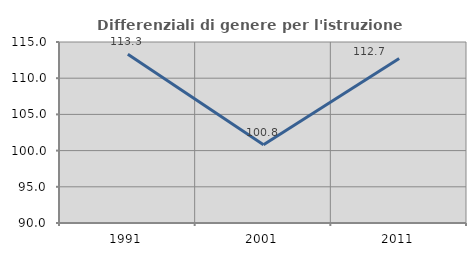
| Category | Differenziali di genere per l'istruzione superiore |
|---|---|
| 1991.0 | 113.3 |
| 2001.0 | 100.81 |
| 2011.0 | 112.732 |